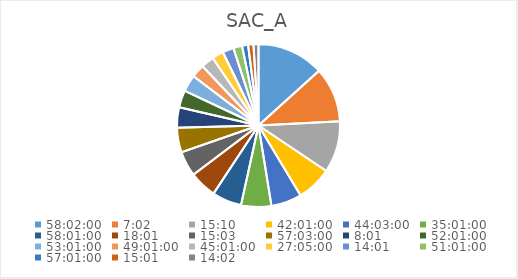
| Category | Series 0 |
|---|---|
| 2.4180555555555556 | 13.82 |
| 0.29305555555555557 | 11.314 |
| 0.6319444444444444 | 10.642 |
| 1.7506944444444443 | 7.242 |
| 1.8354166666666665 | 6.309 |
| 1.4590277777777778 | 6.232 |
| 2.417361111111111 | 6.078 |
| 0.7506944444444444 | 5.62 |
| 0.6270833333333333 | 5.165 |
| 2.377083333333333 | 5.09 |
| 0.3340277777777778 | 4.193 |
| 2.167361111111111 | 3.531 |
| 2.2090277777777776 | 3.458 |
| 2.042361111111111 | 2.733 |
| 1.8756944444444443 | 2.661 |
| 1.128472222222222 | 2.374 |
| 0.5840277777777778 | 2.303 |
| 2.1256944444444446 | 1.806 |
| 2.3756944444444446 | 1.243 |
| 0.6256944444444444 | 1.103 |
| 0.5847222222222223 | 1.034 |